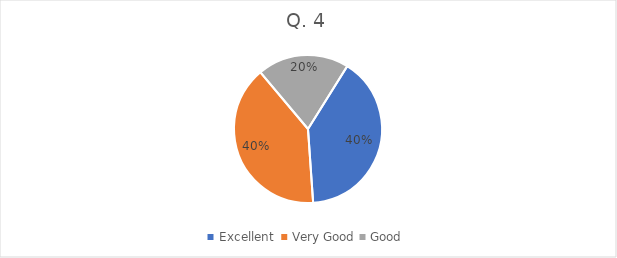
| Category | Series 0 |
|---|---|
| Excellent  | 6 |
| Very Good | 6 |
| Good | 3 |